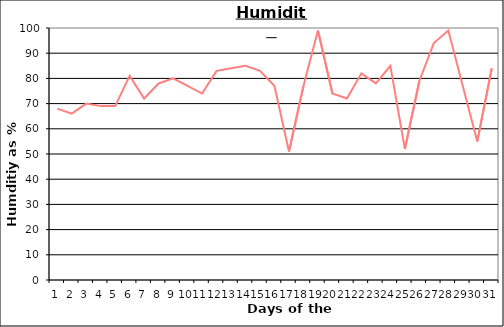
| Category | Series 0 |
|---|---|
| 0 | 68 |
| 1 | 66 |
| 2 | 70 |
| 3 | 69 |
| 4 | 69 |
| 5 | 81 |
| 6 | 72 |
| 7 | 78 |
| 8 | 80 |
| 9 | 77 |
| 10 | 74 |
| 11 | 83 |
| 12 | 84 |
| 13 | 85 |
| 14 | 83 |
| 15 | 77 |
| 16 | 51 |
| 17 | 77 |
| 18 | 99 |
| 19 | 74 |
| 20 | 72 |
| 21 | 82 |
| 22 | 78 |
| 23 | 85 |
| 24 | 52 |
| 25 | 79 |
| 26 | 94 |
| 27 | 99 |
| 28 | 77 |
| 29 | 55 |
| 30 | 84 |